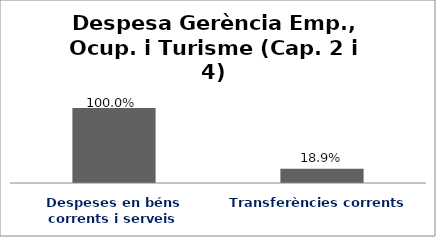
| Category | Series 0 |
|---|---|
| Despeses en béns corrents i serveis | 1 |
| Transferències corrents | 0.189 |